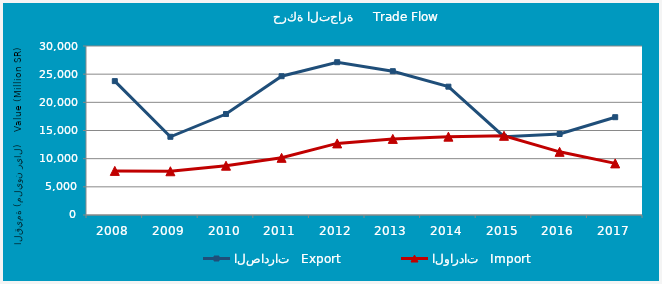
| Category | الصادرات   Export | الواردات   Import |
|---|---|---|
| 2008.0 | 23765198449 | 7832030839 |
| 2009.0 | 13884423893 | 7764077175 |
| 2010.0 | 17924117520 | 8753333046 |
| 2011.0 | 24641185151 | 10149065325 |
| 2012.0 | 27123048072 | 12707459365 |
| 2013.0 | 25528343598 | 13507863954 |
| 2014.0 | 22781533173 | 13907017605 |
| 2015.0 | 13896373530 | 14059367280 |
| 2016.0 | 14379024219 | 11211236280 |
| 2017.0 | 17361733961 | 9161023870 |